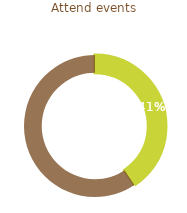
| Category | Attend events |
|---|---|
| 0 | 0.406 |
| 1 | 0.594 |